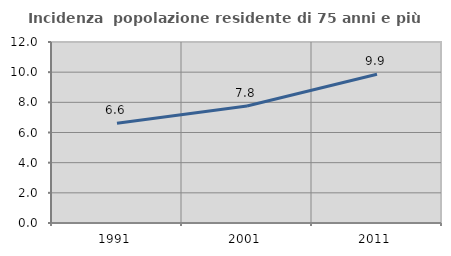
| Category | Incidenza  popolazione residente di 75 anni e più |
|---|---|
| 1991.0 | 6.62 |
| 2001.0 | 7.757 |
| 2011.0 | 9.862 |